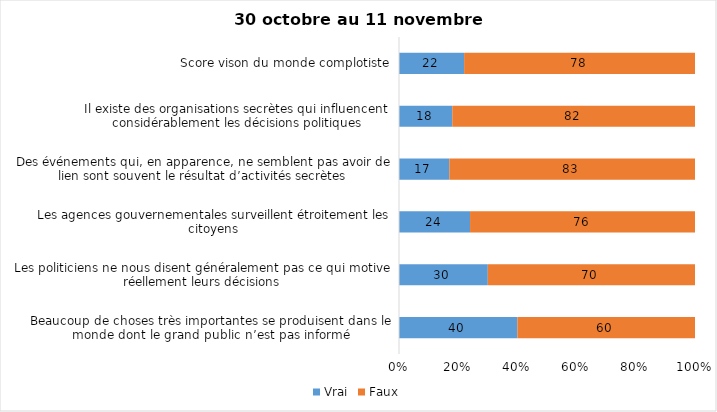
| Category | Vrai | Faux |
|---|---|---|
| Beaucoup de choses très importantes se produisent dans le monde dont le grand public n’est pas informé | 40 | 60 |
| Les politiciens ne nous disent généralement pas ce qui motive réellement leurs décisions | 30 | 70 |
| Les agences gouvernementales surveillent étroitement les citoyens | 24 | 76 |
| Des événements qui, en apparence, ne semblent pas avoir de lien sont souvent le résultat d’activités secrètes | 17 | 83 |
| Il existe des organisations secrètes qui influencent considérablement les décisions politiques | 18 | 82 |
| Score vison du monde complotiste | 22 | 78 |